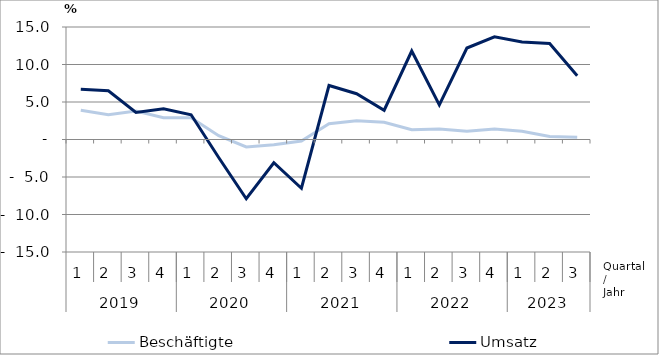
| Category | Beschäftigte | Umsatz |
|---|---|---|
| 0 | 3.9 | 6.7 |
| 1 | 3.3 | 6.5 |
| 2 | 3.8 | 3.6 |
| 3 | 2.9 | 4.1 |
| 4 | 2.9 | 3.3 |
| 5 | 0.5 | -2.4 |
| 6 | -1 | -7.9 |
| 7 | -0.7 | -3.1 |
| 8 | -0.2 | -6.5 |
| 9 | 2.1 | 7.2 |
| 10 | 2.5 | 6.1 |
| 11 | 2.3 | 3.9 |
| 12 | 1.3 | 11.8 |
| 13 | 1.4 | 4.6 |
| 14 | 1.1 | 12.2 |
| 15 | 1.4 | 13.7 |
| 16 | 1.1 | 13 |
| 17 | 0.4 | 12.8 |
| 18 | 0.3 | 8.5 |